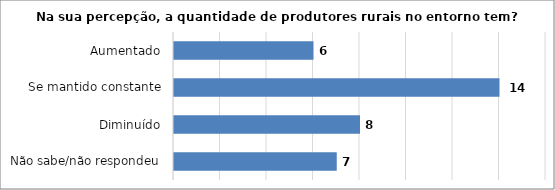
| Category | Series 0 |
|---|---|
| Não sabe/não respondeu | 7 |
| Diminuído | 8 |
| Se mantido constante | 14 |
| Aumentado | 6 |